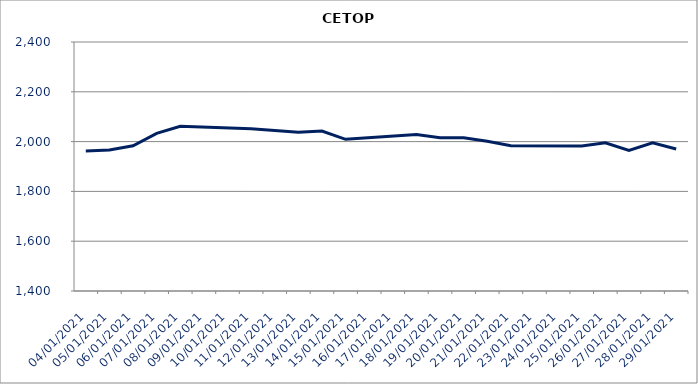
| Category | CETOP |
|---|---|
| 04/01/2021 | 1962.73 |
| 05/01/2021 | 1966.43 |
| 06/01/2021 | 1983.41 |
| 07/01/2021 | 2033.28 |
| 08/01/2021 | 2061.34 |
| 11/01/2021 | 2051.33 |
| 12/01/2021 | 2044.47 |
| 13/01/2021 | 2037.86 |
| 14/01/2021 | 2042.29 |
| 15/01/2021 | 2009.01 |
| 18/01/2021 | 2028.23 |
| 19/01/2021 | 2015.22 |
| 20/01/2021 | 2015.5 |
| 21/01/2021 | 2001.38 |
| 22/01/2021 | 1983.77 |
| 25/01/2021 | 1982.05 |
| 26/01/2021 | 1995.48 |
| 27/01/2021 | 1964.21 |
| 28/01/2021 | 1995.54 |
| 29/01/2021 | 1970.38 |